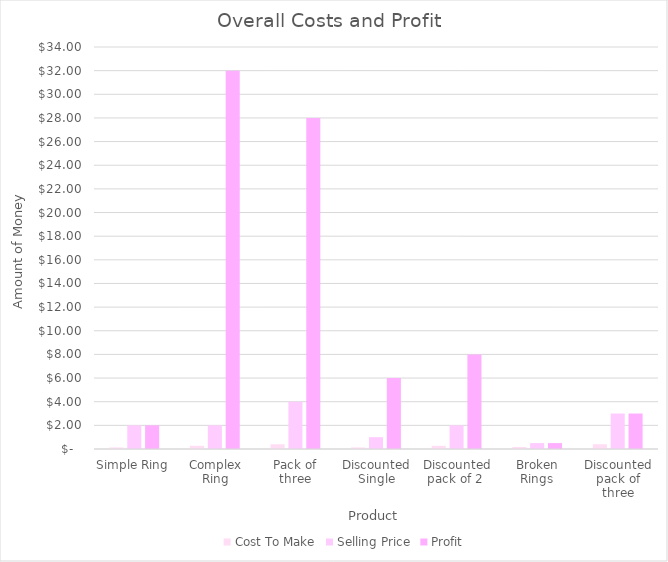
| Category | Cost To Make | Selling Price | Profit |
|---|---|---|---|
| Simple Ring | 0.133 | 2 | 2 |
| Complex Ring | 0.267 | 2 | 32 |
| Pack of three | 0.4 | 4 | 28 |
| Discounted Single | 0.133 | 1 | 6 |
| Discounted pack of 2  | 0.27 | 2 | 8 |
| Broken Rings | 0.17 | 0.5 | 0.5 |
| Discounted pack of three | 0.4 | 3 | 3 |